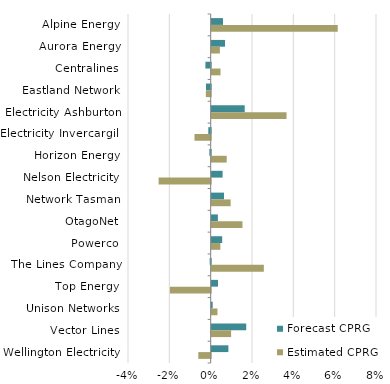
| Category | Forecast CPRG | Estimated CPRG |
|---|---|---|
| Alpine Energy | 0.005 | 0.061 |
| Aurora Energy | 0.006 | 0.004 |
| Centralines | -0.003 | 0.004 |
| Eastland Network | -0.002 | -0.002 |
| Electricity Ashburton | 0.016 | 0.036 |
| Electricity Invercargill | -0.001 | -0.008 |
| Horizon Energy | -0.001 | 0.007 |
| Nelson Electricity | 0.005 | -0.025 |
| Network Tasman | 0.006 | 0.009 |
| OtagoNet | 0.003 | 0.015 |
| Powerco | 0.005 | 0.004 |
| The Lines Company | 0 | 0.025 |
| Top Energy | 0.003 | -0.02 |
| Unison Networks | 0 | 0.003 |
| Vector Lines | 0.017 | 0.009 |
| Wellington Electricity | 0.008 | -0.006 |